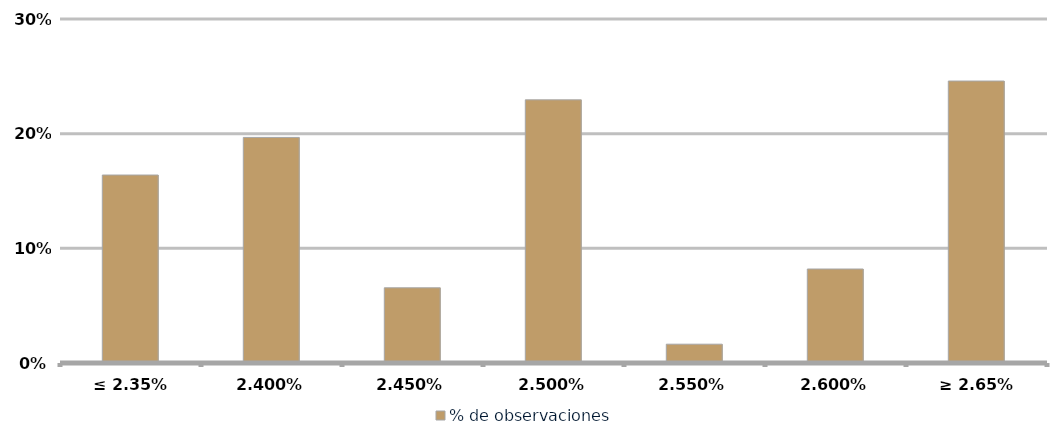
| Category | % de observaciones  |
|---|---|
| ≤ 2.35% | 0.164 |
| 2.40% | 0.197 |
| 2.45% | 0.066 |
| 2.50% | 0.23 |
| 2.55% | 0.016 |
| 2.60% | 0.082 |
| ≥ 2.65% | 0.246 |